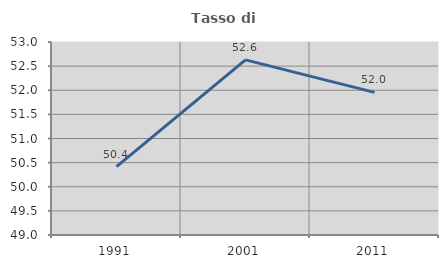
| Category | Tasso di occupazione   |
|---|---|
| 1991.0 | 50.418 |
| 2001.0 | 52.63 |
| 2011.0 | 51.956 |